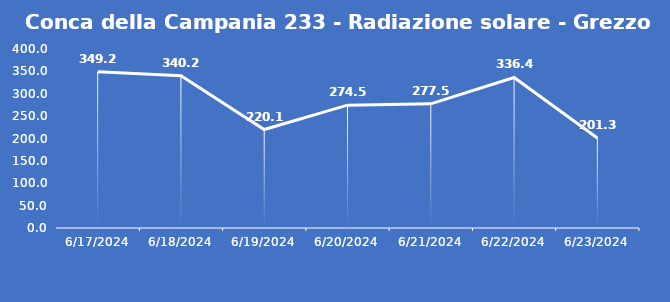
| Category | Conca della Campania 233 - Radiazione solare - Grezzo (W/m2) |
|---|---|
| 6/17/24 | 349.2 |
| 6/18/24 | 340.2 |
| 6/19/24 | 220.1 |
| 6/20/24 | 274.5 |
| 6/21/24 | 277.5 |
| 6/22/24 | 336.4 |
| 6/23/24 | 201.3 |